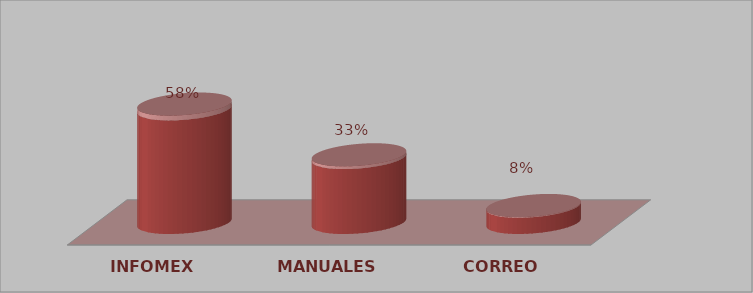
| Category | Series 0 | Series 1 |
|---|---|---|
| INFOMEX | 14 | 0.583 |
| MANUALES | 8 | 0.333 |
| CORREO | 2 | 0.083 |